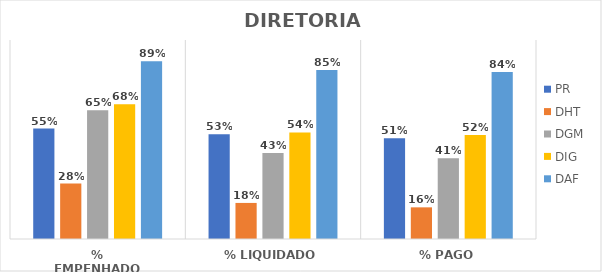
| Category | PR | DHT | DGM | DIG | DAF |
|---|---|---|---|---|---|
| % EMPENHADO | 0.555 | 0.279 | 0.647 | 0.677 | 0.893 |
| % LIQUIDADO | 0.526 | 0.181 | 0.433 | 0.536 | 0.849 |
| % PAGO | 0.506 | 0.159 | 0.406 | 0.522 | 0.839 |